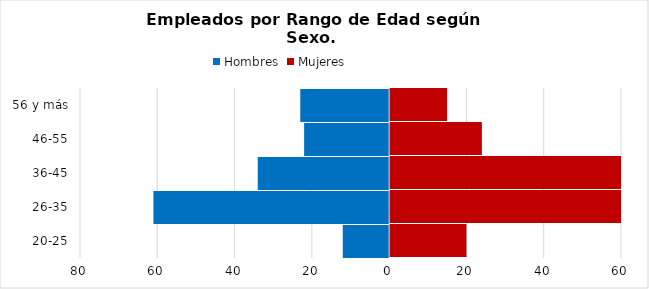
| Category | Hombres | Mujeres |
|---|---|---|
| 20-25 | -12 | 20 |
| 26-35 | -61 | 79 |
| 36-45 | -34 | 60 |
| 46-55 | -22 | 24 |
| 56 y más | -23 | 15 |